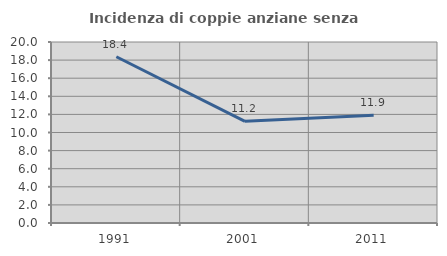
| Category | Incidenza di coppie anziane senza figli  |
|---|---|
| 1991.0 | 18.367 |
| 2001.0 | 11.236 |
| 2011.0 | 11.905 |